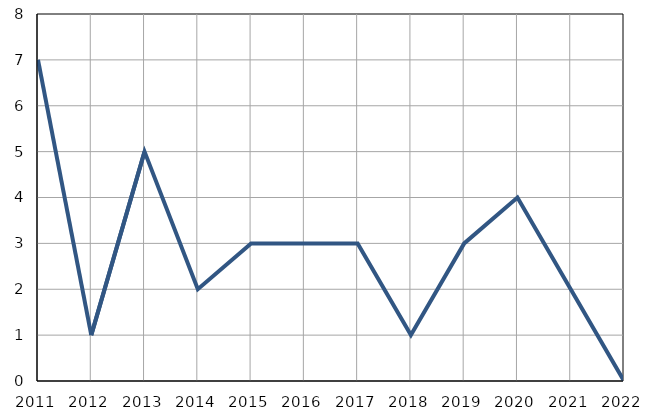
| Category | Infants
deaths |
|---|---|
| 2011.0 | 7 |
| 2012.0 | 1 |
| 2013.0 | 5 |
| 2014.0 | 2 |
| 2015.0 | 3 |
| 2016.0 | 3 |
| 2017.0 | 3 |
| 2018.0 | 1 |
| 2019.0 | 3 |
| 2020.0 | 4 |
| 2021.0 | 2 |
| 2022.0 | 0 |